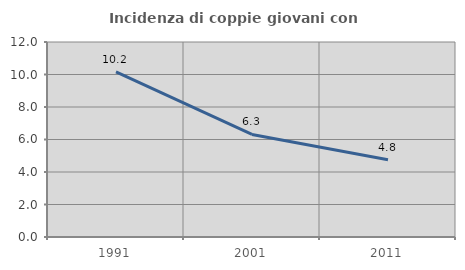
| Category | Incidenza di coppie giovani con figli |
|---|---|
| 1991.0 | 10.159 |
| 2001.0 | 6.312 |
| 2011.0 | 4.756 |